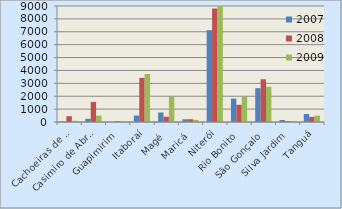
| Category | 2007 | 2008 | 2009 |
|---|---|---|---|
| Cachoeiras de Macacu | 31 | 450 | 95 |
| Casimiro de Abreu | 246 | 1561 | 490 |
| Guapimirim | 7 | 49 | 49 |
| Itaboraí | 499 | 3420 | 3723 |
| Magé | 734 | 413 | 1968 |
| Maricá | 211 | 219 | 163 |
| Niterói | 7129 | 8804 | 8998 |
| Rio Bonito | 1818 | 1335 | 1947 |
| São Gonçalo | 2622 | 3314 | 2735 |
| Silva Jardim | 156 | 61 | 82 |
| Tanguá | 621 | 400 | 495 |